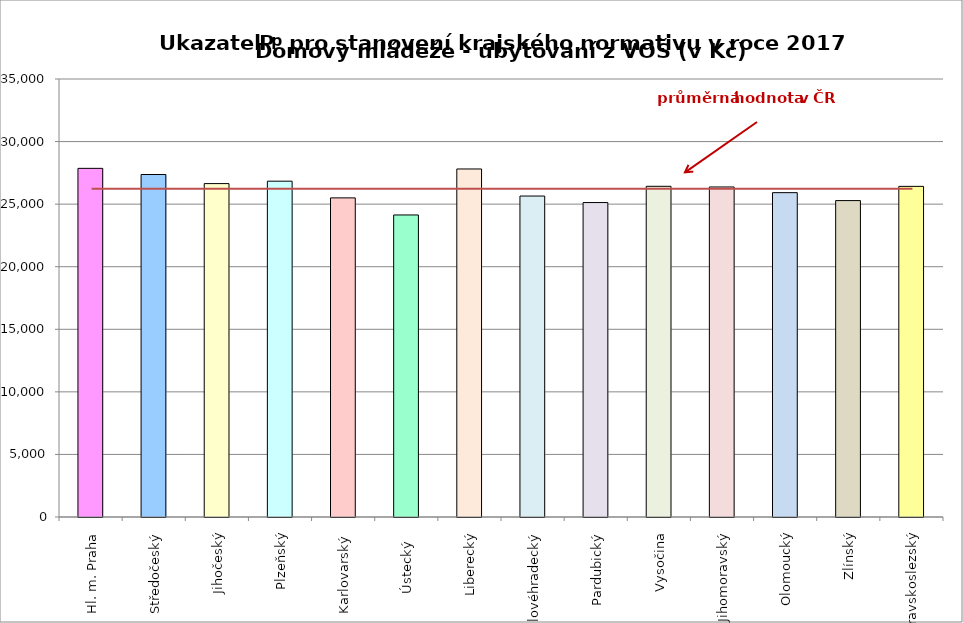
| Category | Series 0 |
|---|---|
| Hl. m. Praha | 27860 |
| Středočeský | 27368 |
| Jihočeský | 26642 |
| Plzeňský | 26835 |
| Karlovarský  | 25500 |
| Ústecký   | 24135 |
| Liberecký | 27810 |
| Královéhradecký | 25648 |
| Pardubický | 25127 |
| Vysočina | 26425 |
| Jihomoravský | 26373 |
| Olomoucký | 25918 |
| Zlínský | 25284 |
| Moravskoslezský | 26420 |